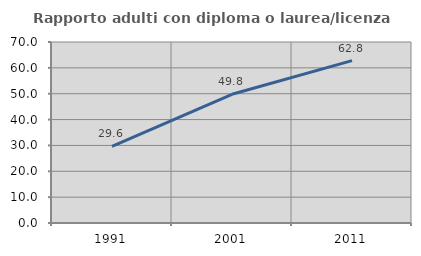
| Category | Rapporto adulti con diploma o laurea/licenza media  |
|---|---|
| 1991.0 | 29.63 |
| 2001.0 | 49.767 |
| 2011.0 | 62.8 |